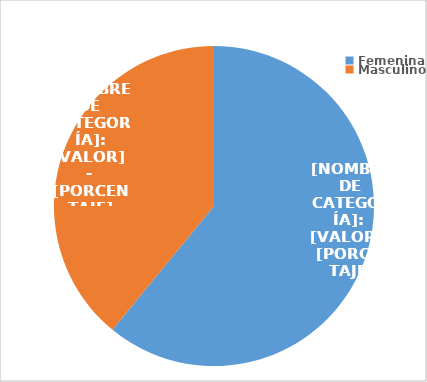
| Category | Series 0 |
|---|---|
| Femenina | 3426 |
| Masculino | 2196 |